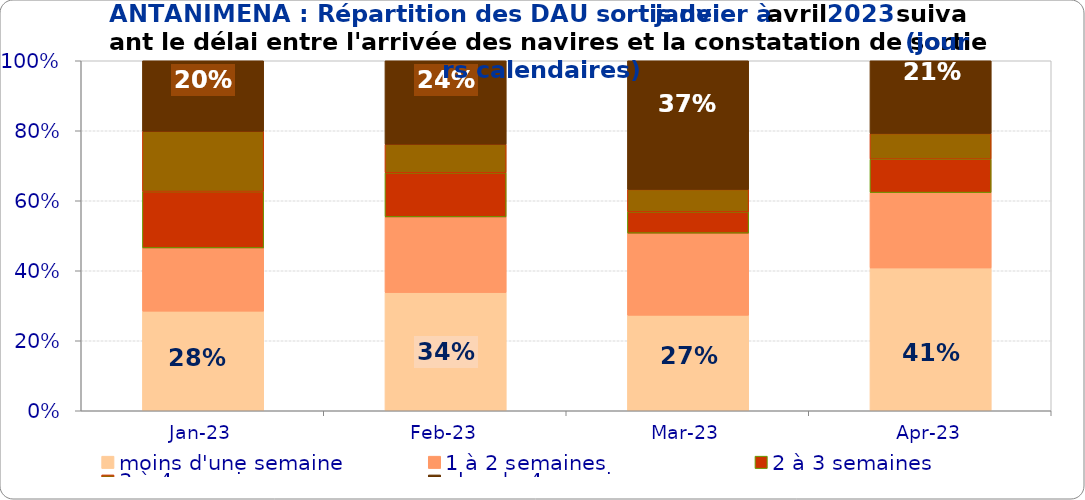
| Category | moins d'une semaine | 1 à 2 semaines | 2 à 3 semaines | 3 à 4 semaines | plus de 4 semaines |
|---|---|---|---|---|---|
| 2023-01-01 | 0.285 | 0.181 | 0.161 | 0.172 | 0.201 |
| 2023-02-01 | 0.338 | 0.216 | 0.126 | 0.082 | 0.238 |
| 2023-03-01 | 0.273 | 0.235 | 0.061 | 0.064 | 0.368 |
| 2023-04-01 | 0.408 | 0.215 | 0.096 | 0.073 | 0.208 |